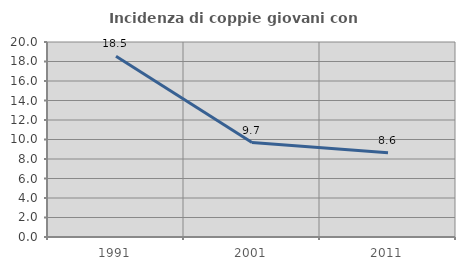
| Category | Incidenza di coppie giovani con figli |
|---|---|
| 1991.0 | 18.534 |
| 2001.0 | 9.682 |
| 2011.0 | 8.63 |